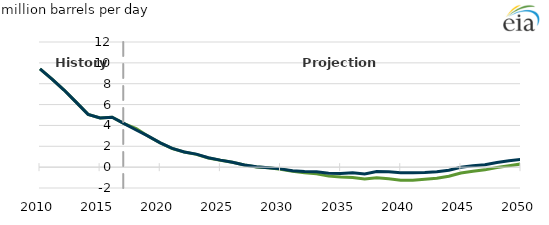
| Category | Mean ANWR | AEO2018 Reference  |
|---|---|---|
| 2010.0 | 9.433 | 9.433 |
| 2011.0 | 8.45 | 8.45 |
| 2012.0 | 7.394 | 7.394 |
| 2013.0 | 6.237 | 6.237 |
| 2014.0 | 5.065 | 5.065 |
| 2015.0 | 4.711 | 4.711 |
| 2016.0 | 4.793 | 4.793 |
| 2017.0 | 4.177 | 4.177 |
| 2018.0 | 3.705 | 3.562 |
| 2019.0 | 2.964 | 2.969 |
| 2020.0 | 2.328 | 2.335 |
| 2021.0 | 1.785 | 1.794 |
| 2022.0 | 1.444 | 1.456 |
| 2023.0 | 1.224 | 1.246 |
| 2024.0 | 0.883 | 0.897 |
| 2025.0 | 0.652 | 0.671 |
| 2026.0 | 0.462 | 0.473 |
| 2027.0 | 0.2 | 0.214 |
| 2028.0 | 0.021 | 0.04 |
| 2029.0 | -0.063 | -0.049 |
| 2030.0 | -0.195 | -0.166 |
| 2031.0 | -0.389 | -0.343 |
| 2032.0 | -0.538 | -0.424 |
| 2033.0 | -0.645 | -0.45 |
| 2034.0 | -0.862 | -0.589 |
| 2035.0 | -0.949 | -0.613 |
| 2036.0 | -0.983 | -0.536 |
| 2037.0 | -1.139 | -0.654 |
| 2038.0 | -1.01 | -0.423 |
| 2039.0 | -1.12 | -0.453 |
| 2040.0 | -1.255 | -0.546 |
| 2041.0 | -1.26 | -0.541 |
| 2042.0 | -1.165 | -0.513 |
| 2043.0 | -1.062 | -0.436 |
| 2044.0 | -0.875 | -0.29 |
| 2045.0 | -0.559 | -0.013 |
| 2046.0 | -0.387 | 0.129 |
| 2047.0 | -0.26 | 0.224 |
| 2048.0 | -0.026 | 0.444 |
| 2049.0 | 0.137 | 0.618 |
| 2050.0 | 0.302 | 0.749 |